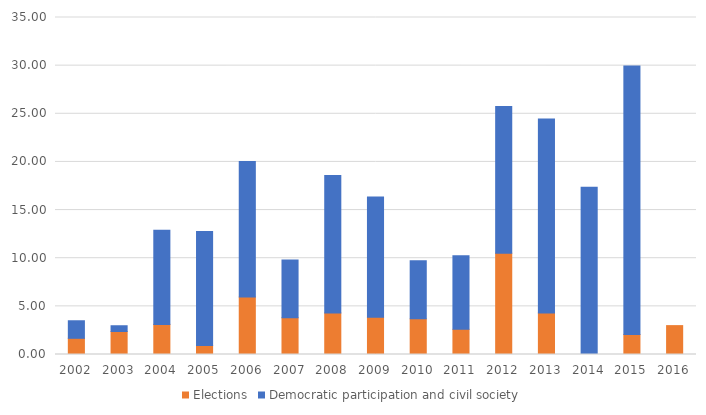
| Category | Elections | Democratic participation and civil society |
|---|---|---|
| 2002.0 | 1.682 | 1.822 |
| 2003.0 | 2.386 | 0.601 |
| 2004.0 | 3.127 | 9.779 |
| 2005.0 | 0.947 | 11.816 |
| 2006.0 | 5.977 | 14.065 |
| 2007.0 | 3.823 | 5.999 |
| 2008.0 | 4.317 | 14.267 |
| 2009.0 | 3.877 | 12.487 |
| 2010.0 | 3.702 | 6.041 |
| 2011.0 | 2.614 | 7.631 |
| 2012.0 | 10.512 | 15.24 |
| 2013.0 | 4.31 | 20.156 |
| 2014.0 | 0 | 17.372 |
| 2015.0 | 2.083 | 27.876 |
| 2016.0 | 3 | 0 |